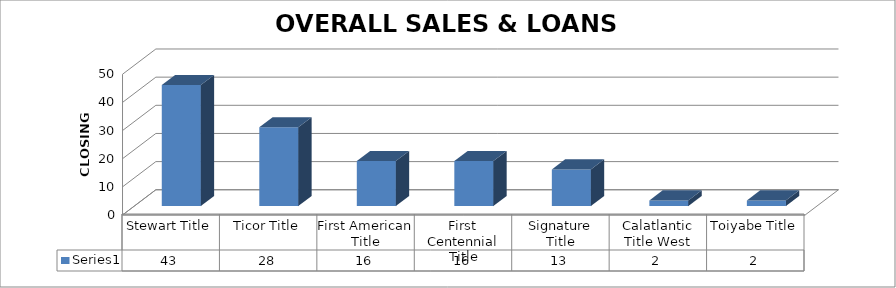
| Category | Series 0 |
|---|---|
| Stewart Title | 43 |
| Ticor Title | 28 |
| First American Title | 16 |
| First Centennial Title | 16 |
| Signature Title | 13 |
| Calatlantic Title West | 2 |
| Toiyabe Title | 2 |